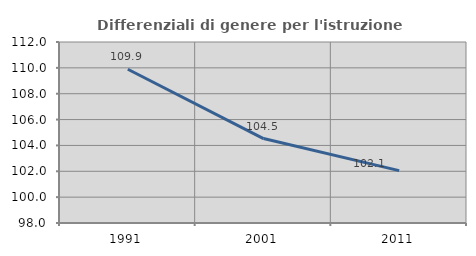
| Category | Differenziali di genere per l'istruzione superiore |
|---|---|
| 1991.0 | 109.894 |
| 2001.0 | 104.53 |
| 2011.0 | 102.051 |